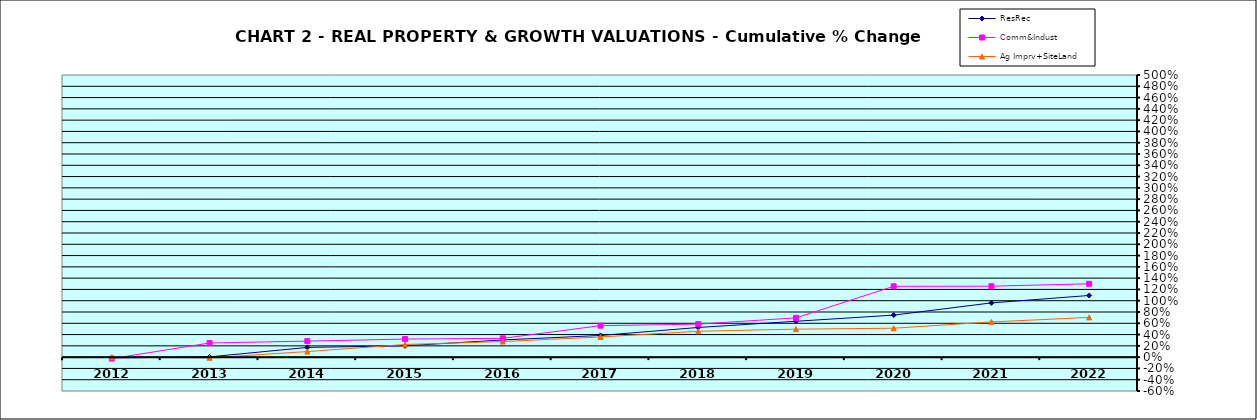
| Category | ResRec | Comm&Indust | Ag Imprv+SiteLand |
|---|---|---|---|
| 2012.0 | -0.013 | -0.026 | 0 |
| 2013.0 | 0.005 | 0.251 | -0.012 |
| 2014.0 | 0.172 | 0.284 | 0.099 |
| 2015.0 | 0.201 | 0.32 | 0.224 |
| 2016.0 | 0.305 | 0.333 | 0.276 |
| 2017.0 | 0.384 | 0.558 | 0.358 |
| 2018.0 | 0.526 | 0.585 | 0.459 |
| 2019.0 | 0.636 | 0.696 | 0.496 |
| 2020.0 | 0.745 | 1.255 | 0.512 |
| 2021.0 | 0.961 | 1.257 | 0.624 |
| 2022.0 | 1.093 | 1.3 | 0.704 |